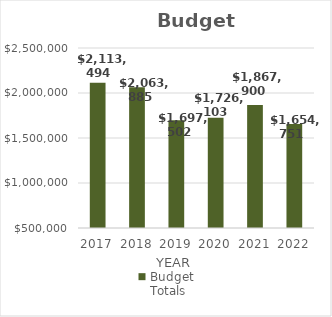
| Category | Budget Totals |
|---|---|
| 2017.0 | 2113494 |
| 2018.0 | 2063885 |
| 2019.0 | 1697502 |
| 2020.0 | 1726103 |
| 2021.0 | 1867900 |
| 2022.0 | 1654751 |